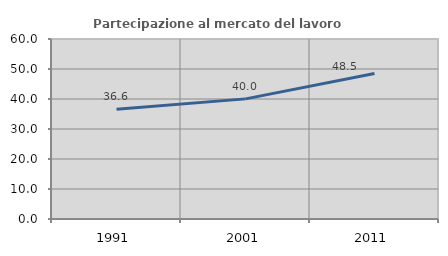
| Category | Partecipazione al mercato del lavoro  femminile |
|---|---|
| 1991.0 | 36.558 |
| 2001.0 | 40.041 |
| 2011.0 | 48.522 |